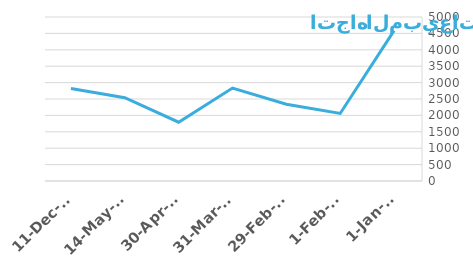
| Category | شاشة عرض |
|---|---|
| 1-Jan-12 | 4585 |
| 1-Feb-12 | 2059 |
| 29-Feb-12 | 2342 |
| 31-Mar-12 | 2833 |
| 30-Apr-12 | 1792 |
| 14-May-12 | 2539 |
| 11-Dec-13 | 2818 |